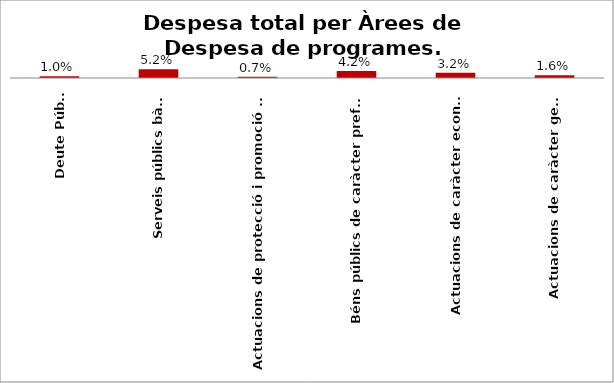
| Category | Series 0 |
|---|---|
| Deute Públic | 0.01 |
| Serveis públics bàsics | 0.052 |
| Actuacions de protecció i promoció social | 0.007 |
| Béns públics de caràcter preferent | 0.042 |
| Actuacions de caràcter econòmic | 0.032 |
| Actuacions de caràcter general | 0.016 |